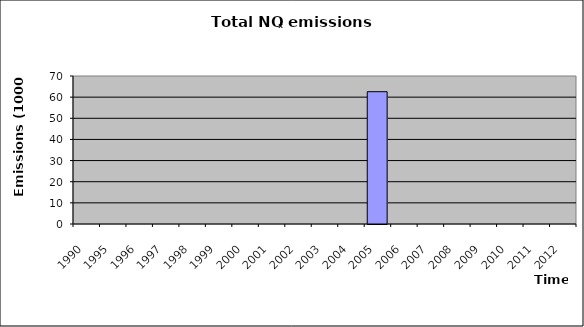
| Category | Series 0 |
|---|---|
| 1990.0 | 0 |
| 1995.0 | 0 |
| 1996.0 | 0 |
| 1997.0 | 0 |
| 1998.0 | 0 |
| 1999.0 | 0 |
| 2000.0 | 0 |
| 2001.0 | 0 |
| 2002.0 | 0 |
| 2003.0 | 0 |
| 2004.0 | 0 |
| 2005.0 | 62.58 |
| 2006.0 | 0 |
| 2007.0 | 0 |
| 2008.0 | 0 |
| 2009.0 | 0 |
| 2010.0 | 0 |
| 2011.0 | 0 |
| 2012.0 | 0 |